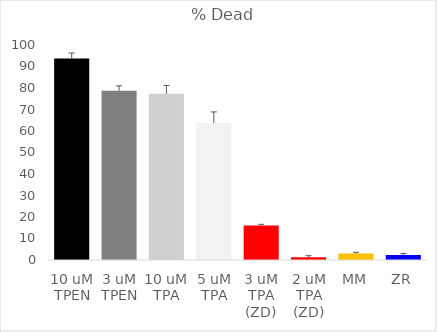
| Category | AVG % dead |
|---|---|
| 10 uM TPEN | 93.667 |
| 3 uM TPEN | 78.667 |
| 10 uM TPA | 77.333 |
| 5 uM TPA | 63.667 |
| 3 uM TPA (ZD) | 16 |
| 2 uM TPA (ZD) | 1.333 |
| MM | 3 |
| ZR | 2.333 |